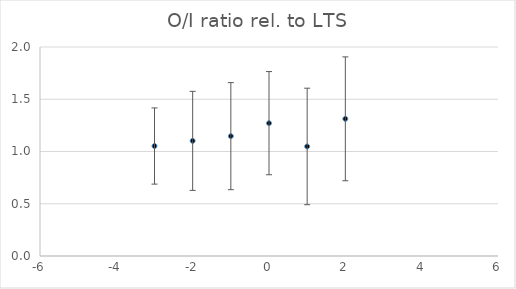
| Category | Series 0 |
|---|---|
| -3.0 | 1.052 |
| -2.0 | 1.102 |
| -1.0 | 1.147 |
| 0.0 | 1.271 |
| 1.0 | 1.048 |
| 2.0 | 1.313 |